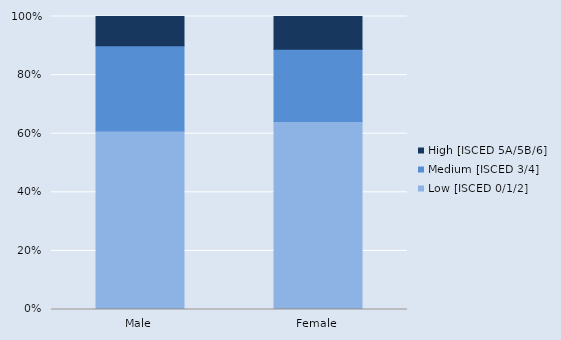
| Category | Low [ISCED 0/1/2] | Medium [ISCED 3/4] | High [ISCED 5A/5B/6] |
|---|---|---|---|
| Male | 444439 | 212438 | 72988 |
| Female | 438782 | 168424 | 76506 |